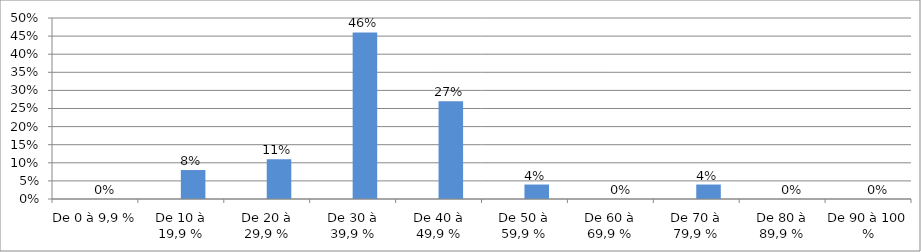
| Category | Series 0 | Series 1 |
|---|---|---|
| De 0 à 9,9 % |  | 0 |
| De 10 à 19,9 % |  | 0.08 |
| De 20 à 29,9 % |  | 0.11 |
| De 30 à 39,9 % |  | 0.46 |
| De 40 à 49,9 % |  | 0.27 |
| De 50 à 59,9 % |  | 0.04 |
| De 60 à 69,9 % |  | 0 |
| De 70 à 79,9 % |  | 0.04 |
| De 80 à 89,9 % |  | 0 |
| De 90 à 100 % |  | 0 |